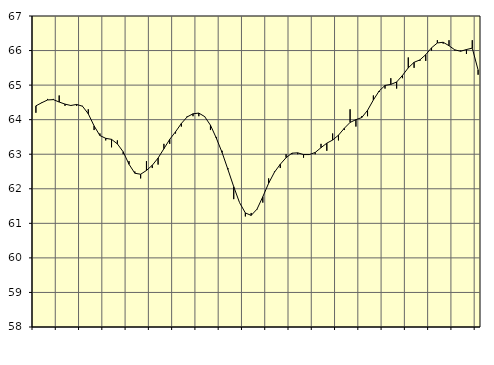
| Category | Piggar | Series 1 |
|---|---|---|
| nan | 64.2 | 64.4 |
| 1.0 | 64.5 | 64.49 |
| 1.0 | 64.6 | 64.57 |
| 1.0 | 64.6 | 64.58 |
| nan | 64.7 | 64.51 |
| 2.0 | 64.4 | 64.45 |
| 2.0 | 64.4 | 64.41 |
| 2.0 | 64.4 | 64.44 |
| nan | 64.4 | 64.39 |
| 3.0 | 64.3 | 64.17 |
| 3.0 | 63.7 | 63.82 |
| 3.0 | 63.6 | 63.54 |
| nan | 63.4 | 63.46 |
| 4.0 | 63.2 | 63.43 |
| 4.0 | 63.4 | 63.3 |
| 4.0 | 63 | 63.07 |
| nan | 62.8 | 62.71 |
| 5.0 | 62.5 | 62.45 |
| 5.0 | 62.3 | 62.42 |
| 5.0 | 62.8 | 62.53 |
| nan | 62.6 | 62.68 |
| 6.0 | 62.7 | 62.89 |
| 6.0 | 63.3 | 63.16 |
| 6.0 | 63.3 | 63.43 |
| nan | 63.6 | 63.65 |
| 7.0 | 63.8 | 63.89 |
| 7.0 | 64.1 | 64.08 |
| 7.0 | 64.1 | 64.17 |
| nan | 64.1 | 64.19 |
| 8.0 | 64.1 | 64.09 |
| 8.0 | 63.7 | 63.84 |
| 8.0 | 63.5 | 63.47 |
| nan | 63.1 | 63.05 |
| 9.0 | 62.6 | 62.56 |
| 9.0 | 61.7 | 62.06 |
| 9.0 | 61.6 | 61.6 |
| nan | 61.2 | 61.3 |
| 10.0 | 61.3 | 61.23 |
| 10.0 | 61.4 | 61.41 |
| 10.0 | 61.6 | 61.77 |
| nan | 62.3 | 62.16 |
| 11.0 | 62.5 | 62.48 |
| 11.0 | 62.6 | 62.71 |
| 11.0 | 63 | 62.9 |
| nan | 63 | 63.03 |
| 12.0 | 63 | 63.04 |
| 12.0 | 62.9 | 62.99 |
| 12.0 | 63 | 62.99 |
| nan | 63 | 63.05 |
| 13.0 | 63.3 | 63.19 |
| 13.0 | 63.1 | 63.32 |
| 13.0 | 63.6 | 63.41 |
| nan | 63.4 | 63.55 |
| 14.0 | 63.7 | 63.75 |
| 14.0 | 64.3 | 63.92 |
| 14.0 | 63.8 | 64 |
| nan | 64.1 | 64.06 |
| 15.0 | 64.1 | 64.27 |
| 15.0 | 64.7 | 64.57 |
| 15.0 | 64.8 | 64.83 |
| nan | 64.9 | 64.99 |
| 16.0 | 65.2 | 65.02 |
| 16.0 | 64.9 | 65.09 |
| 16.0 | 65.2 | 65.28 |
| nan | 65.8 | 65.5 |
| 17.0 | 65.5 | 65.66 |
| 17.0 | 65.7 | 65.73 |
| 17.0 | 65.7 | 65.88 |
| nan | 66 | 66.08 |
| 18.0 | 66.3 | 66.22 |
| 18.0 | 66.2 | 66.24 |
| 18.0 | 66.3 | 66.14 |
| nan | 66 | 66.02 |
| 19.0 | 66 | 65.98 |
| 19.0 | 65.9 | 66.03 |
| 19.0 | 66.3 | 66.07 |
| nan | 65.3 | 65.44 |